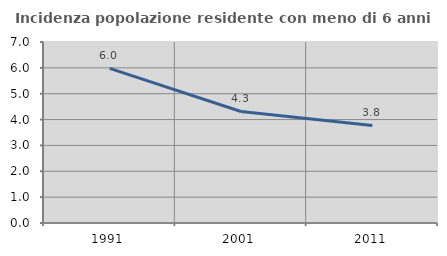
| Category | Incidenza popolazione residente con meno di 6 anni |
|---|---|
| 1991.0 | 5.98 |
| 2001.0 | 4.313 |
| 2011.0 | 3.772 |